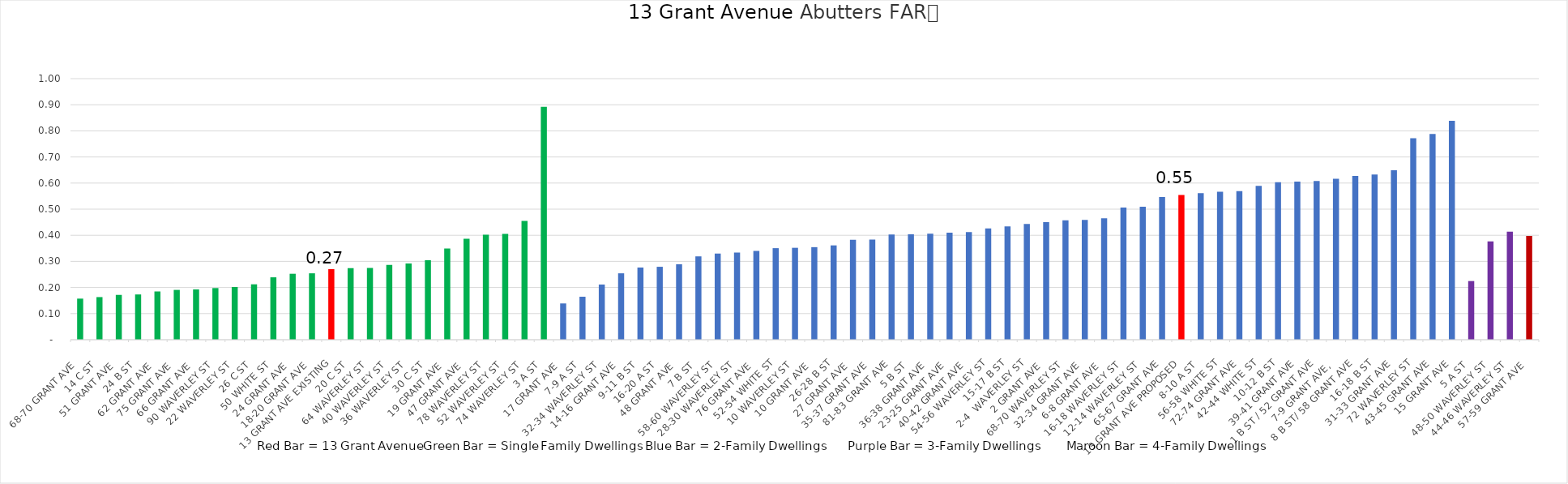
| Category | FAR |
|---|---|
| 68-70 GRANT AVE  | 0.157 |
| 14 C ST  | 0.163 |
| 51 GRANT AVE  | 0.172 |
| 24 B ST  | 0.173 |
| 62 GRANT AVE  | 0.185 |
| 75 GRANT AVE  | 0.191 |
| 66 GRANT AVE  | 0.193 |
| 90 WAVERLEY ST  | 0.198 |
| 22 WAVERLEY ST  | 0.202 |
| 26 C ST  | 0.212 |
| 50 WHITE ST  | 0.239 |
| 24 GRANT AVE  | 0.253 |
| 18-20 GRANT AVE  | 0.254 |
| 13 GRANT AVE EXISTING | 0.27 |
| 20 C ST  | 0.274 |
| 64 WAVERLEY ST  | 0.275 |
| 40 WAVERLEY ST  | 0.286 |
| 36 WAVERLEY ST  | 0.292 |
| 30 C ST  | 0.305 |
| 19 GRANT AVE  | 0.349 |
| 47 GRANT AVE  | 0.387 |
| 78 WAVERLEY ST  | 0.402 |
| 52 WAVERLEY ST  | 0.405 |
| 74 WAVERLEY ST  | 0.455 |
| 3 A ST  | 0.892 |
| 17 GRANT AVE  | 0.139 |
| 7-9 A ST  | 0.165 |
| 32-34 WAVERLEY ST  | 0.211 |
| 14-16 GRANT AVE  | 0.254 |
| 9-11 B ST  | 0.277 |
| 16-20 A ST  | 0.279 |
| 48 GRANT AVE  | 0.289 |
| 7 B ST  | 0.319 |
| 58-60 WAVERLEY ST  | 0.33 |
| 28-30 WAVERLEY ST  | 0.334 |
| 76 GRANT AVE  | 0.34 |
| 52-54 WHITE ST | 0.351 |
| 10 WAVERLEY ST  | 0.352 |
| 10 GRANT AVE  | 0.354 |
| 26-28 B ST | 0.361 |
| 27 GRANT AVE  | 0.383 |
| 35-37 GRANT AVE  | 0.384 |
| 81-83 GRANT AVE | 0.403 |
| 5 B ST  | 0.404 |
| 36-38 GRANT AVE  | 0.406 |
| 23-25 GRANT AVE  | 0.41 |
| 40-42 GRANT AVE  | 0.412 |
| 54-56 WAVERLEY ST | 0.426 |
| 15-17 B ST | 0.434 |
| 2-4  WAVERLEY ST | 0.443 |
| 2 GRANT AVE  | 0.451 |
| 68-70 WAVERLEY ST  | 0.457 |
| 32-34 GRANT AVE  | 0.459 |
| 6-8 GRANT AVE  | 0.465 |
| 16-18 WAVERLEY ST  | 0.506 |
| 12-14 WAVERLEY ST  | 0.509 |
| 65-67 GRANT AVE | 0.546 |
| 13 GRANT AVE PROPOSED | 0.554 |
| 8-10 A ST  | 0.561 |
| 56-58 WHITE ST | 0.567 |
| 72-74 GRANT AVE | 0.569 |
| 42-44 WHITE ST | 0.589 |
| 10-12 B ST | 0.603 |
| 39-41 GRANT AVE | 0.606 |
| 1 B ST / 52 GRANT AVE | 0.608 |
| 7-9 GRANT AVE,  | 0.616 |
| 8 B ST/ 58 GRANT AVE | 0.628 |
| 16-18 B ST | 0.633 |
| 31-33 GRANT AVE | 0.649 |
| 72 WAVERLEY ST | 0.772 |
| 43-45 GRANT AVE | 0.788 |
| 15 GRANT AVE | 0.838 |
| 5 A ST  | 0.225 |
| 48-50 WAVERLEY ST  | 0.377 |
| 44-46 WAVERLEY ST  | 0.414 |
| 57-59 GRANT AVE  | 0.398 |